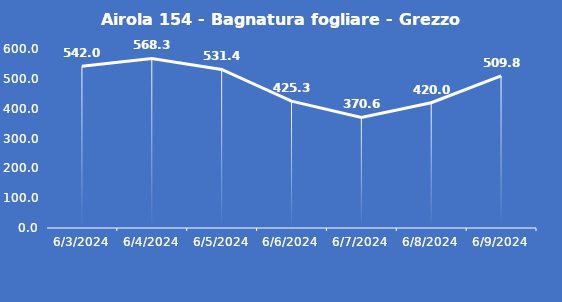
| Category | Airola 154 - Bagnatura fogliare - Grezzo (min) |
|---|---|
| 6/3/24 | 542 |
| 6/4/24 | 568.3 |
| 6/5/24 | 531.4 |
| 6/6/24 | 425.3 |
| 6/7/24 | 370.6 |
| 6/8/24 | 420 |
| 6/9/24 | 509.8 |